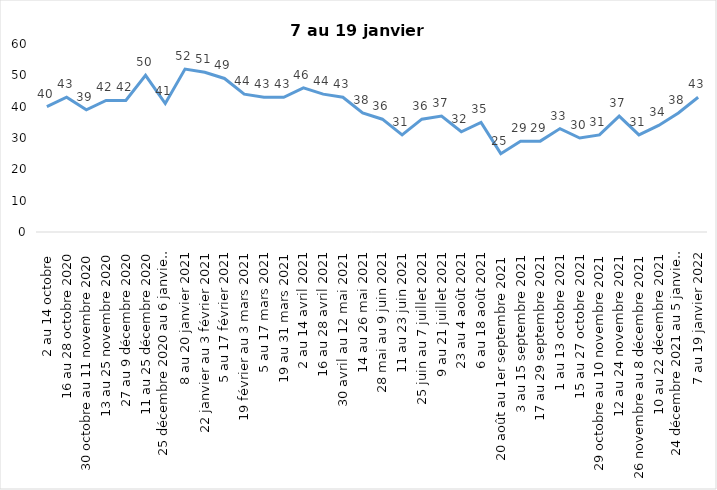
| Category | Toujours aux trois mesures |
|---|---|
| 2 au 14 octobre  | 40 |
| 16 au 28 octobre 2020 | 43 |
| 30 octobre au 11 novembre 2020 | 39 |
| 13 au 25 novembre 2020 | 42 |
| 27 au 9 décembre 2020 | 42 |
| 11 au 25 décembre 2020 | 50 |
| 25 décembre 2020 au 6 janvier 2021 | 41 |
| 8 au 20 janvier 2021 | 52 |
| 22 janvier au 3 février 2021 | 51 |
| 5 au 17 février 2021 | 49 |
| 19 février au 3 mars 2021 | 44 |
| 5 au 17 mars 2021 | 43 |
| 19 au 31 mars 2021 | 43 |
| 2 au 14 avril 2021 | 46 |
| 16 au 28 avril 2021 | 44 |
| 30 avril au 12 mai 2021 | 43 |
| 14 au 26 mai 2021 | 38 |
| 28 mai au 9 juin 2021 | 36 |
| 11 au 23 juin 2021 | 31 |
| 25 juin au 7 juillet 2021 | 36 |
| 9 au 21 juillet 2021 | 37 |
| 23 au 4 août 2021 | 32 |
| 6 au 18 août 2021 | 35 |
| 20 août au 1er septembre 2021 | 25 |
| 3 au 15 septembre 2021 | 29 |
| 17 au 29 septembre 2021 | 29 |
| 1 au 13 octobre 2021 | 33 |
| 15 au 27 octobre 2021 | 30 |
| 29 octobre au 10 novembre 2021 | 31 |
| 12 au 24 novembre 2021 | 37 |
| 26 novembre au 8 décembre 2021 | 31 |
| 10 au 22 décembre 2021 | 34 |
| 24 décembre 2021 au 5 janvier 2022 2022 | 38 |
| 7 au 19 janvier 2022 | 43 |